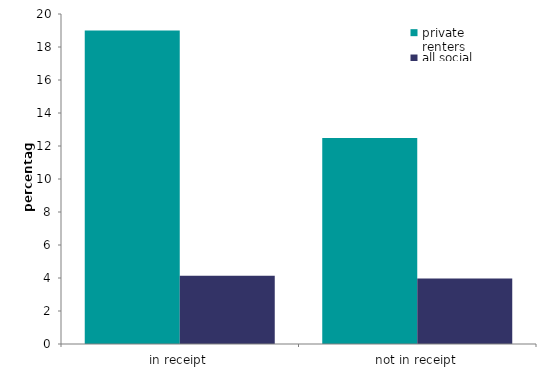
| Category | private
renters | all social
renters |
|---|---|---|
| in receipt | 18.993 | 4.14 |
| not in receipt | 12.488 | 3.976 |